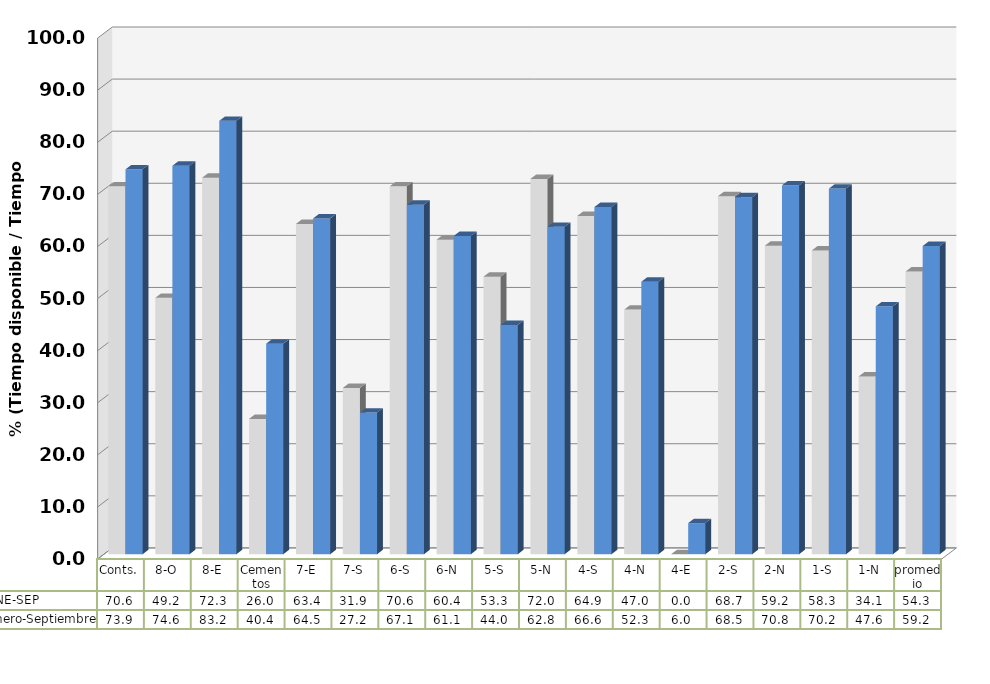
| Category | ENE-SEP | Enero-Septiembre |
|---|---|---|
| Conts. | 70.616 | 73.883 |
| 8-O | 49.219 | 74.568 |
| 8-E | 72.29 | 83.197 |
| Cementos | 25.98 | 40.425 |
| 7-E | 63.408 | 64.465 |
| 7-S | 31.923 | 27.182 |
| 6-S | 70.62 | 67.084 |
| 6-N | 60.388 | 61.099 |
| 5-S | 53.282 | 44.013 |
| 5-N | 72.049 | 62.846 |
| 4-S | 64.948 | 66.645 |
| 4-N | 46.958 | 52.311 |
| 4-E | 0 | 5.98 |
| 2-S | 68.734 | 68.528 |
| 2-N | 59.237 | 70.812 |
| 1-S | 58.317 | 70.187 |
| 1-N | 34.131 | 47.577 |
| promedio | 54.265 | 59.166 |